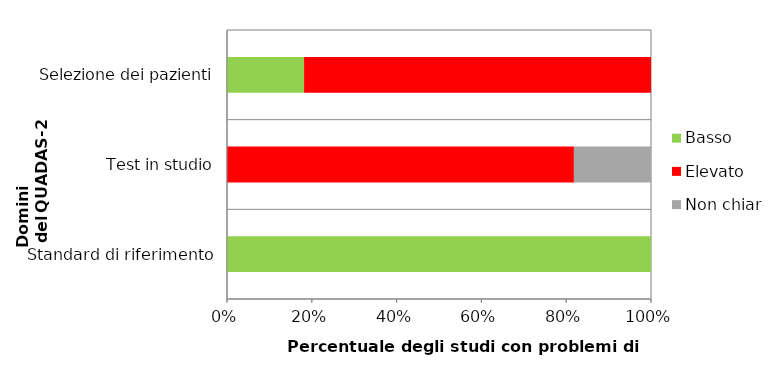
| Category | Basso | Elevato | Non chiaro |
|---|---|---|---|
| Selezione dei pazienti | 2 | 9 | 0 |
| Test in studio | 0 | 9 | 2 |
| Standard di riferimento | 11 | 0 | 0 |